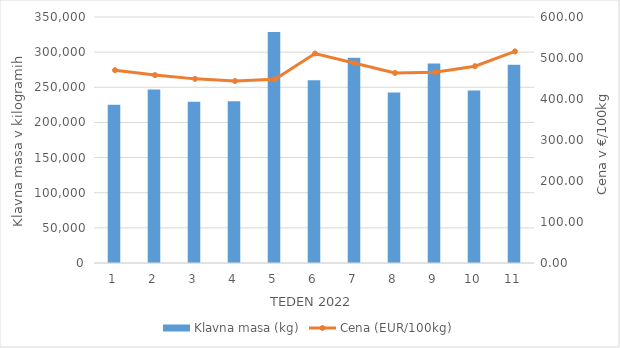
| Category | Klavna masa (kg) |
|---|---|
| 1.0 | 225300 |
| 2.0 | 246712 |
| 3.0 | 229541 |
| 4.0 | 230074 |
| 5.0 | 328640 |
| 6.0 | 260108 |
| 7.0 | 291887 |
| 8.0 | 242732 |
| 9.0 | 283987 |
| 10.0 | 245414 |
| 11.0 | 282092 |